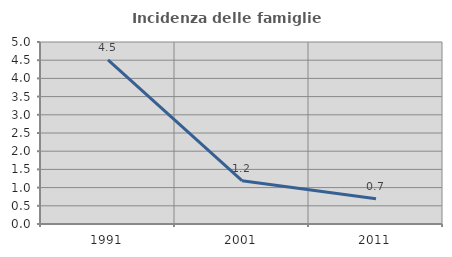
| Category | Incidenza delle famiglie numerose |
|---|---|
| 1991.0 | 4.506 |
| 2001.0 | 1.19 |
| 2011.0 | 0.694 |